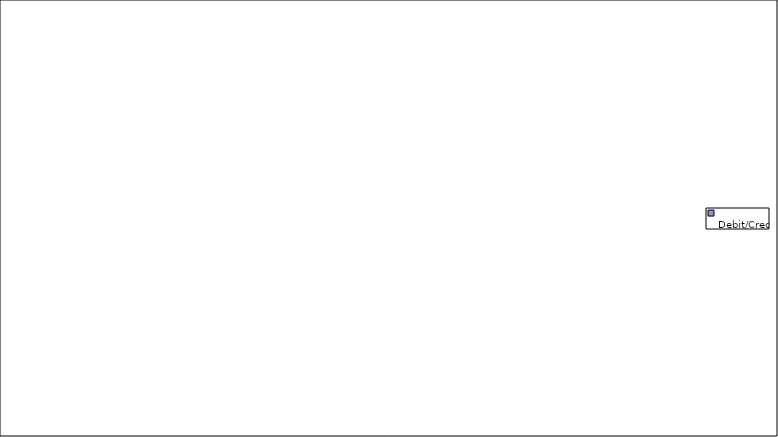
| Category | 
Debit/Credit Amount
JAN 2014 -DEC 2014 | 
Ending Balance
JAN 2014 -DEC 2014 |
|---|---|---|
| 0 | -50497.01 | 0 |
| 1 | 401454.47 | 0 |
| 2 | -2652.46 | 0 |
| 3 | 9429228.02 | 0 |
| 4 | -446701.91 | 0 |
| 5 | -213826.68 | 0 |
| 6 | 213826.68 | 0 |
| 7 | 5304.92 | 0 |
| 8 | 9336136.03 | 0 |